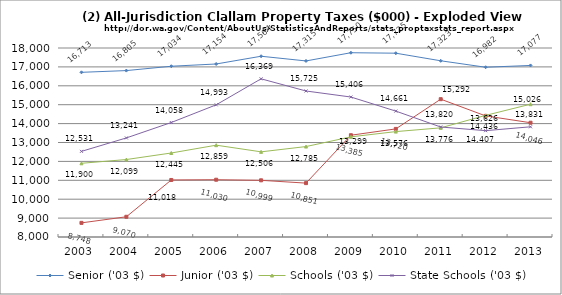
| Category | Senior ('03 $) | Junior ('03 $) | Schools ('03 $) | State Schools ('03 $) |
|---|---|---|---|---|
| 2003.0 | 16712.997 | 8747.718 | 11900.047 | 12531.118 |
| 2004.0 | 16804.944 | 9070.427 | 12098.986 | 13241.459 |
| 2005.0 | 17034.445 | 11017.502 | 12444.986 | 14057.975 |
| 2006.0 | 17154.002 | 11030.213 | 12858.573 | 14992.871 |
| 2007.0 | 17563.745 | 10999.088 | 12506.121 | 16368.934 |
| 2008.0 | 17315.39 | 10851.109 | 12785.46 | 15725.111 |
| 2009.0 | 17749.991 | 13385.163 | 13298.502 | 15406.459 |
| 2010.0 | 17725 | 13719.912 | 13576.409 | 14661.026 |
| 2011.0 | 17323.481 | 15292.01 | 13775.813 | 13819.7 |
| 2012.0 | 16981.905 | 14407.274 | 14435.772 | 13625.939 |
| 2013.0 | 17076.593 | 14046.42 | 15026.03 | 13830.805 |